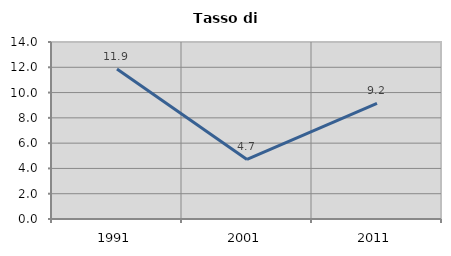
| Category | Tasso di disoccupazione   |
|---|---|
| 1991.0 | 11.864 |
| 2001.0 | 4.71 |
| 2011.0 | 9.153 |